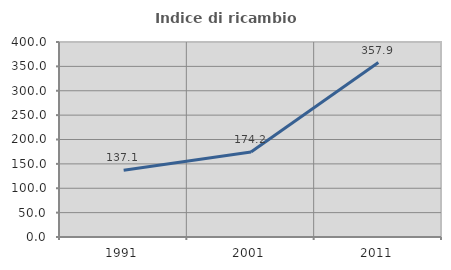
| Category | Indice di ricambio occupazionale  |
|---|---|
| 1991.0 | 137.143 |
| 2001.0 | 174.194 |
| 2011.0 | 357.895 |